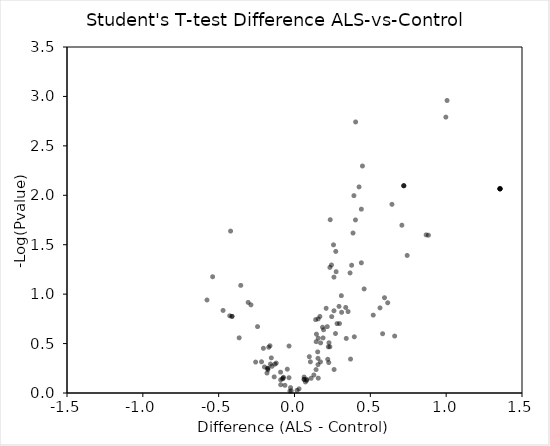
| Category | Student's T-test Difference ALS_Control |
|---|---|
| 1.35493228912353 | 2.066 |
| 0.642621154785157 | 1.909 |
| 1.35493228912353 | 2.066 |
| 1.35493228912353 | 2.066 |
| 0.720641021728518 | 2.097 |
| 0.8678747177124 | 1.599 |
| 1.35493228912353 | 2.066 |
| 0.707984046936033 | 1.697 |
| 1.35493228912353 | 2.066 |
| 1.35493228912353 | 2.066 |
| 0.883152008056641 | 1.596 |
| 0.997884330749514 | 2.791 |
| 0.720641021728518 | 2.097 |
| 0.720641021728518 | 2.097 |
| 1.00593780517578 | 2.959 |
| 0.742925033569335 | 1.391 |
| 0.660593605041505 | 0.576 |
| 0.614676132202149 | 0.913 |
| 0.593421096801759 | 0.964 |
| 0.58085952758789 | 0.599 |
| 0.56360912322998 | 0.861 |
| 0.519194030761721 | 0.788 |
| 0.459145889282226 | 1.053 |
| 0.448139076232909 | 2.296 |
| 0.440776634216306 | 1.86 |
| 0.440558662414553 | 1.317 |
| 0.425558815002439 | 2.085 |
| 0.402927017211912 | 2.742 |
| 0.40203556060791 | 1.751 |
| 0.394392738342283 | 0.568 |
| 0.391838302612303 | 1.996 |
| 0.385819778442382 | 1.618 |
| 0.376781234741209 | 1.292 |
| 0.369464759826659 | 0.343 |
| 0.366345367431641 | 1.214 |
| 0.3532438659668 | 0.824 |
| 0.341194458007813 | 0.552 |
| 0.337832031250002 | 0.865 |
| 0.310730400085447 | 0.816 |
| 0.308894958496094 | 0.985 |
| 0.296603698730468 | 0.702 |
| 0.293628196716309 | 0.876 |
| 0.280454292297364 | 0.702 |
| 0.274440689086916 | 1.227 |
| 0.272227706909181 | 1.432 |
| 0.270322952270508 | 0.602 |
| 0.26096824645996 | 0.237 |
| 0.26025733947754 | 0.832 |
| 0.260249977111815 | 1.172 |
| 0.257202720642091 | 1.499 |
| 0.245315208435059 | 0.773 |
| 0.243798217773438 | 1.295 |
| 0.235543479919432 | 1.753 |
| 0.233450546264649 | 1.271 |
| 0.233388595581054 | 0.468 |
| 0.227242774963379 | 0.508 |
| 0.225949707031248 | 0.308 |
| 0.222995452880859 | 0.467 |
| 0.219111442565918 | 0.341 |
| 0.216046447753907 | 0.671 |
| 0.208608436584473 | 0.857 |
| 0.191788177490235 | 0.64 |
| 0.188440208435058 | 0.557 |
| 0.184905014038083 | 0.665 |
| 0.172333602905272 | 0.507 |
| 0.171274375915527 | 0.315 |
| 0.167537994384766 | 0.774 |
| 0.156639671325685 | 0.15 |
| 0.156637344360352 | 0.554 |
| 0.156160240173335 | 0.75 |
| 0.154943313598633 | 0.287 |
| 0.1549157333374 | 0.351 |
| 0.153068046569828 | 0.416 |
| 0.144813613891603 | 0.595 |
| 0.142889175415039 | 0.519 |
| 0.142180633544925 | 0.237 |
| 0.139439430236816 | 0.742 |
| 0.127732391357423 | 0.182 |
| 0.109684753417969 | 0.149 |
| 0.104763259887694 | 0.315 |
| 0.0976000595092792 | 0.367 |
| 0.0809887313842772 | 0.138 |
| 0.0807320404052732 | 0.128 |
| 0.0718802261352529 | 0.112 |
| 0.0633982467651357 | 0.161 |
| 0.0633956527709962 | 0.138 |
| 0.0633956527709962 | 0.138 |
| 0.0296725845336923 | 0.042 |
| 0.0168598175048835 | 0.027 |
| -0.0213908004760732 | 0.022 |
| -0.026001701354982 | 0.055 |
| -0.0305169677734369 | 0.019 |
| -0.0360853576660105 | 0.475 |
| -0.0362290954589852 | 0.155 |
| -0.0475611877441402 | 0.241 |
| -0.0630134201049835 | 0.078 |
| -0.072664947509768 | 0.159 |
| -0.074844894409182 | 0.15 |
| -0.0791073989868174 | 0.143 |
| -0.0907569503784202 | 0.083 |
| -0.0912856292724626 | 0.134 |
| -0.0920531082153317 | 0.211 |
| -0.120533981323241 | 0.303 |
| -0.128903999328614 | 0.292 |
| -0.133773536682128 | 0.163 |
| -0.148628273010253 | 0.27 |
| -0.152826881408693 | 0.355 |
| -0.158424339294434 | 0.293 |
| -0.161817436218261 | 0.478 |
| -0.169570388793943 | 0.463 |
| -0.175089683532715 | 0.25 |
| -0.175179862976076 | 0.235 |
| -0.17801414489746 | 0.25 |
| -0.181324119567872 | 0.202 |
| -0.198051834106444 | 0.263 |
| -0.204997787475584 | 0.452 |
| -0.21747169494629 | 0.316 |
| -0.243723182678224 | 0.672 |
| -0.256303176879882 | 0.313 |
| -0.287098617553717 | 0.892 |
| -0.305616836547852 | 0.916 |
| -0.354443016052247 | 1.089 |
| -0.364740409851073 | 0.558 |
| -0.412091064453126 | 0.775 |
| -0.412091064453126 | 0.775 |
| -0.421429405212404 | 1.638 |
| -0.427157249450683 | 0.781 |
| -0.470997047424316 | 0.835 |
| -0.53985466003418 | 1.176 |
| -0.576944274902345 | 0.941 |